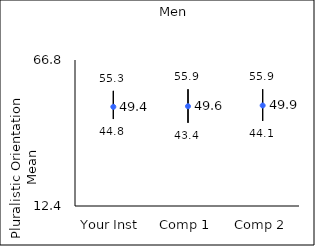
| Category | 25th percentile | 75th percentile | Mean |
|---|---|---|---|
| Your Inst | 44.8 | 55.3 | 49.35 |
| Comp 1 | 43.4 | 55.9 | 49.57 |
| Comp 2 | 44.1 | 55.9 | 49.85 |